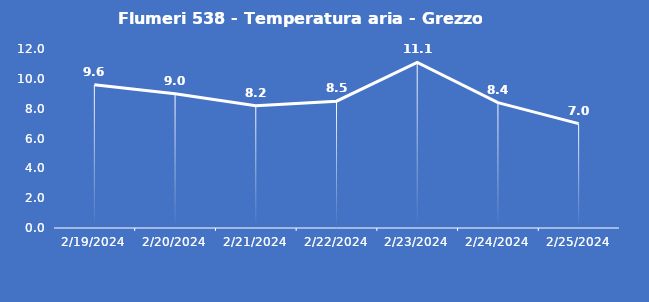
| Category | Flumeri 538 - Temperatura aria - Grezzo (°C) |
|---|---|
| 2/19/24 | 9.6 |
| 2/20/24 | 9 |
| 2/21/24 | 8.2 |
| 2/22/24 | 8.5 |
| 2/23/24 | 11.1 |
| 2/24/24 | 8.4 |
| 2/25/24 | 7 |